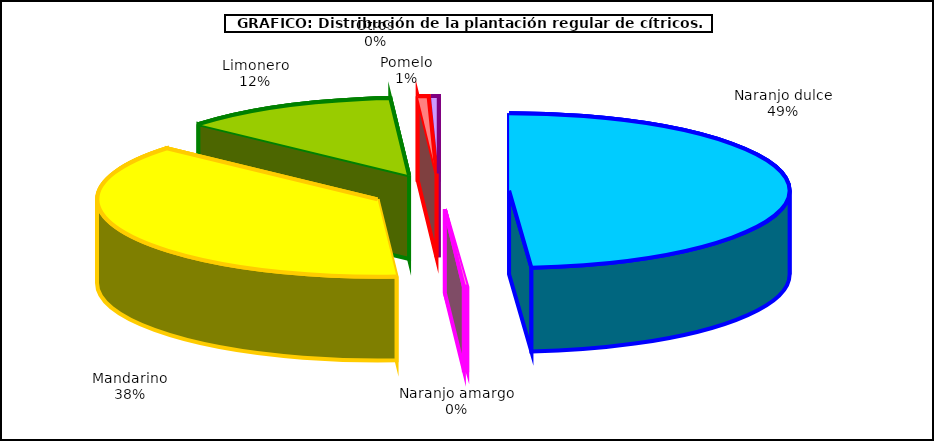
| Category | Series 0 |
|---|---|
| 0 | 146742 |
| 1 | 569 |
| 2 | 113102 |
| 3 | 37498 |
| 4 | 1864 |
| 5 | 1349 |